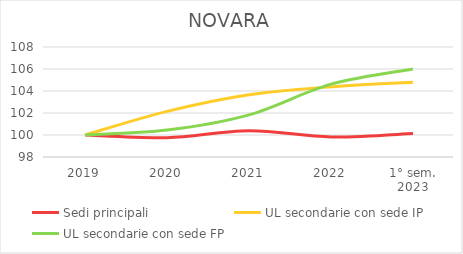
| Category | Sedi principali | UL secondarie con sede IP | UL secondarie con sede FP |
|---|---|---|---|
| 2019 | 100 | 100 | 100 |
| 2020 | 99.758 | 102.146 | 100.449 |
| 2021 | 100.393 | 103.66 | 101.829 |
| 2022 | 99.819 | 104.375 | 104.621 |
| 1° sem.
2023 | 100.139 | 104.796 | 106.001 |